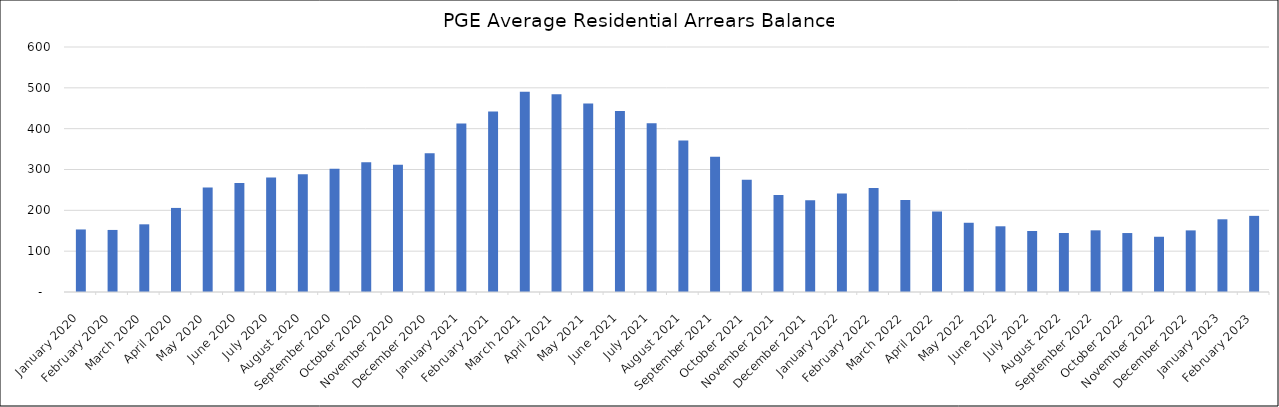
| Category | Average Arrears Balance |
|---|---|
| 2020-01-01 | 153.16 |
| 2020-02-01 | 151.992 |
| 2020-03-01 | 165.748 |
| 2020-04-01 | 205.887 |
| 2020-05-01 | 256.11 |
| 2020-06-01 | 266.681 |
| 2020-07-01 | 280.55 |
| 2020-08-01 | 288.657 |
| 2020-09-01 | 301.676 |
| 2020-10-01 | 317.578 |
| 2020-11-01 | 311.532 |
| 2020-12-01 | 339.657 |
| 2021-01-01 | 412.932 |
| 2021-02-01 | 442 |
| 2021-03-01 | 490.446 |
| 2021-04-01 | 484.223 |
| 2021-05-01 | 461.766 |
| 2021-06-01 | 443.006 |
| 2021-07-01 | 413.297 |
| 2021-08-01 | 370.729 |
| 2021-09-01 | 331.003 |
| 2021-10-01 | 274.964 |
| 2021-11-01 | 237.801 |
| 2021-12-01 | 224.457 |
| 2022-01-01 | 240.92 |
| 2022-02-01 | 254.896 |
| 2022-03-01 | 225.133 |
| 2022-04-01 | 197.143 |
| 2022-05-01 | 169.565 |
| 2022-06-01 | 160.924 |
| 2022-07-01 | 149.415 |
| 2022-08-01 | 144.496 |
| 2022-09-01 | 151.025 |
| 2022-10-01 | 144.398 |
| 2022-11-01 | 135.288 |
| 2022-12-01 | 150.881 |
| 2023-01-01 | 178.057 |
| 2023-02-01 | 186.463 |